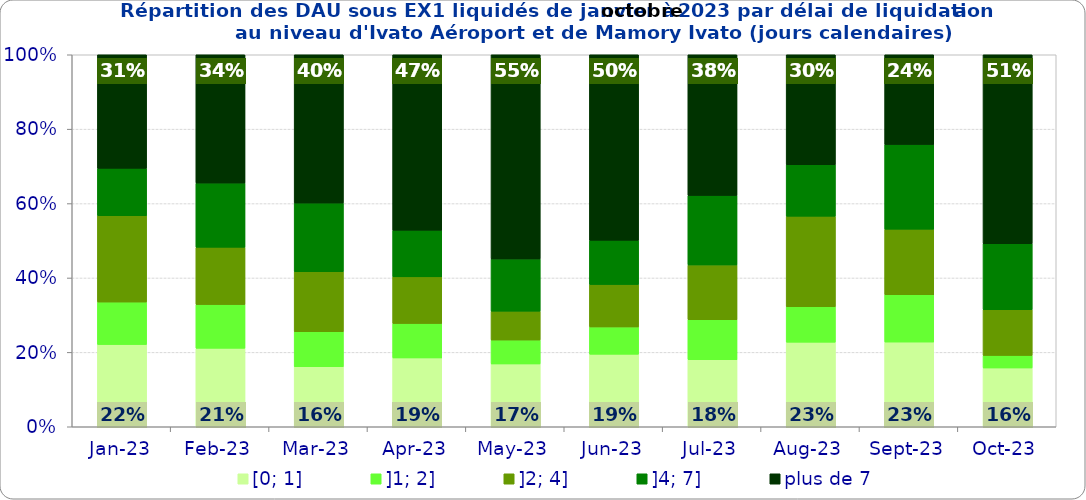
| Category | [0; 1] | ]1; 2] | ]2; 4] | ]4; 7] | plus de 7 |
|---|---|---|---|---|---|
| 2023-01-01 | 0.221 | 0.114 | 0.232 | 0.127 | 0.305 |
| 2023-02-01 | 0.211 | 0.117 | 0.154 | 0.172 | 0.345 |
| 2023-03-01 | 0.161 | 0.094 | 0.161 | 0.185 | 0.399 |
| 2023-04-01 | 0.185 | 0.093 | 0.125 | 0.125 | 0.472 |
| 2023-05-01 | 0.169 | 0.064 | 0.078 | 0.14 | 0.549 |
| 2023-06-01 | 0.195 | 0.073 | 0.114 | 0.119 | 0.499 |
| 2023-07-01 | 0.18 | 0.108 | 0.147 | 0.187 | 0.378 |
| 2023-08-01 | 0.227 | 0.095 | 0.243 | 0.138 | 0.296 |
| 2023-09-01 | 0.228 | 0.127 | 0.176 | 0.228 | 0.241 |
| 2023-10-01 | 0.158 | 0.034 | 0.123 | 0.177 | 0.508 |